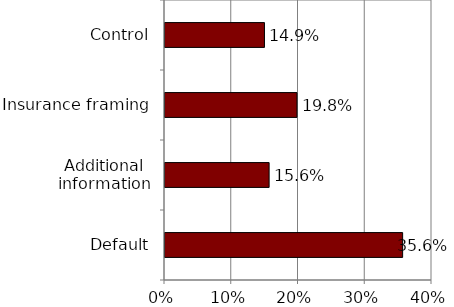
| Category | Series 0 |
|---|---|
| Default | 0.356 |
| Additional information | 0.156 |
| Insurance framing | 0.198 |
| Control | 0.149 |